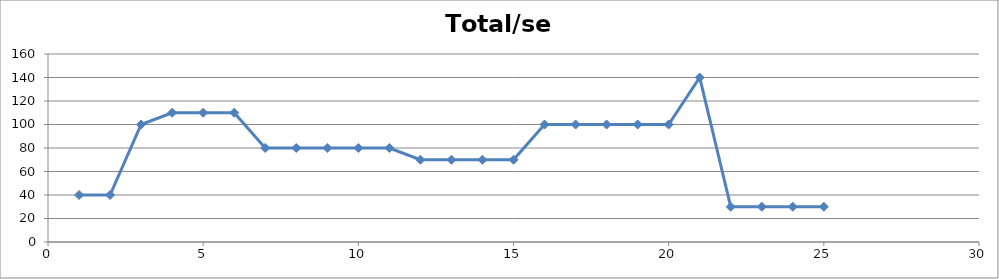
| Category | Total/sem |
|---|---|
| 1.0 | 40 |
| 2.0 | 40 |
| 3.0 | 100 |
| 4.0 | 110 |
| 5.0 | 110 |
| 6.0 | 110 |
| 7.0 | 80 |
| 8.0 | 80 |
| 9.0 | 80 |
| 10.0 | 80 |
| 11.0 | 80 |
| 12.0 | 70 |
| 13.0 | 70 |
| 14.0 | 70 |
| 15.0 | 70 |
| 16.0 | 100 |
| 17.0 | 100 |
| 18.0 | 100 |
| 19.0 | 100 |
| 20.0 | 100 |
| 21.0 | 140 |
| 22.0 | 30 |
| 23.0 | 30 |
| 24.0 | 30 |
| 25.0 | 30 |